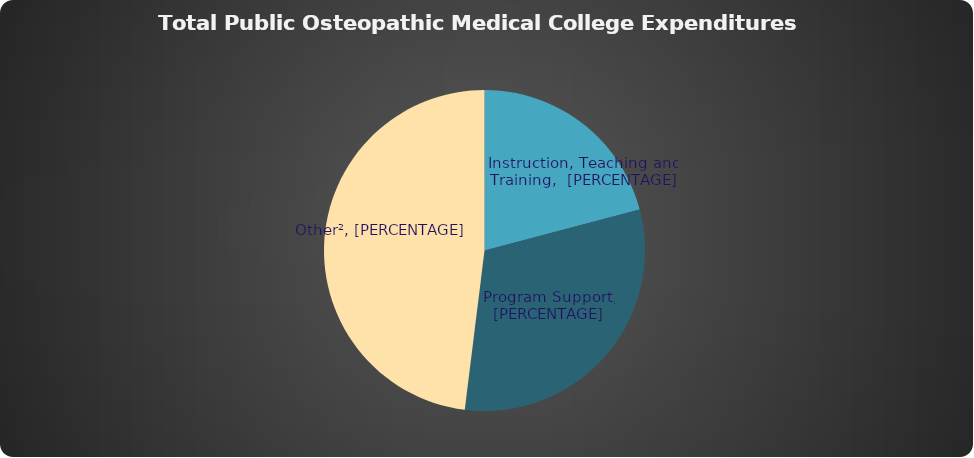
| Category | Series 0 |
|---|---|
| 0 | 190614448 |
| 1 | 283464400 |
| 2 | 438300208 |